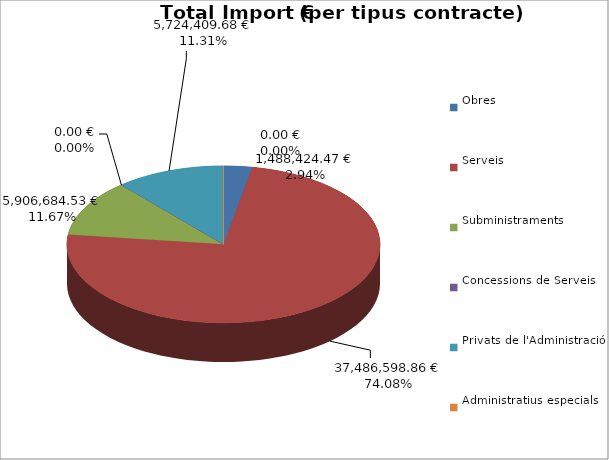
| Category | Total preu
(amb IVA) |
|---|---|
| Obres | 1488424.47 |
| Serveis | 37486598.86 |
| Subministraments | 5906684.53 |
| Concessions de Serveis | 0 |
| Privats de l'Administració | 5724409.68 |
| Administratius especials | 0 |